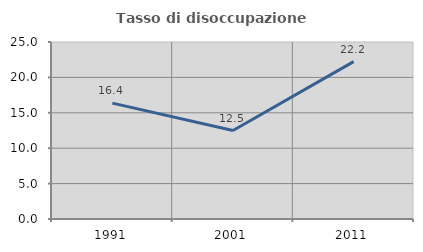
| Category | Tasso di disoccupazione giovanile  |
|---|---|
| 1991.0 | 16.364 |
| 2001.0 | 12.5 |
| 2011.0 | 22.222 |